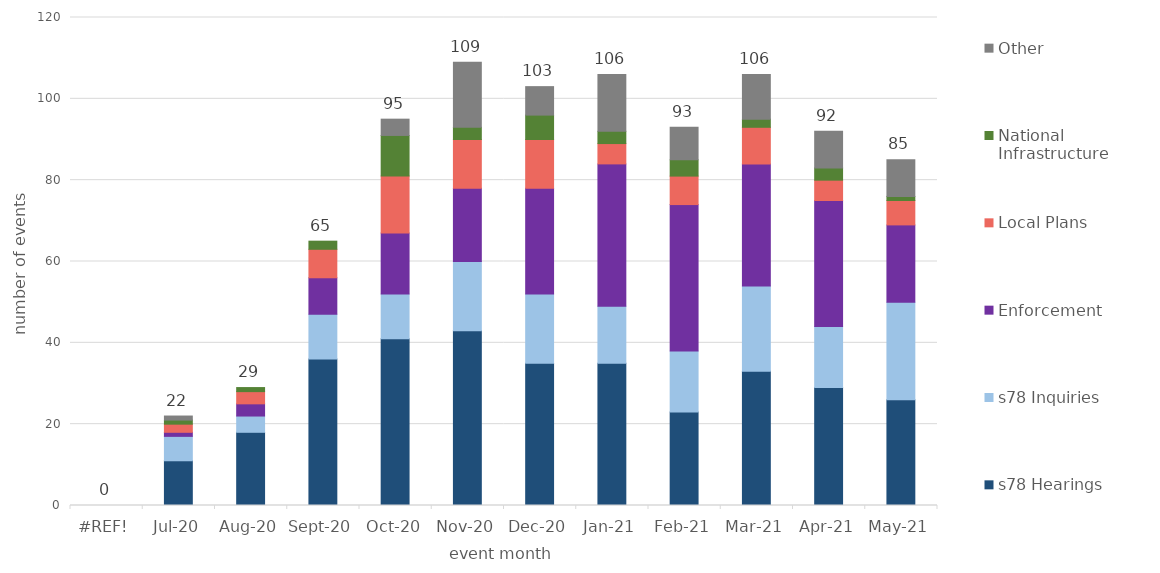
| Category | s78 Hearings | s78 Inquiries | Enforcement | Local Plans | National Infrastructure | Other |
|---|---|---|---|---|---|---|
| 0.0 | 0 | 0 | 0 | 0 | 0 | 0 |
| 2020-07-01 | 11 | 6 | 1 | 2 | 1 | 1 |
| 2020-08-01 | 18 | 4 | 3 | 3 | 1 | 0 |
| 2020-09-01 | 36 | 11 | 9 | 7 | 2 | 0 |
| 2020-10-01 | 41 | 11 | 15 | 14 | 10 | 4 |
| 2020-11-01 | 43 | 17 | 18 | 12 | 3 | 16 |
| 2020-12-01 | 35 | 17 | 26 | 12 | 6 | 7 |
| 2021-01-01 | 35 | 14 | 35 | 5 | 3 | 14 |
| 2021-02-01 | 23 | 15 | 36 | 7 | 4 | 8 |
| 2021-03-01 | 33 | 21 | 30 | 9 | 2 | 11 |
| 2021-04-01 | 29 | 15 | 31 | 5 | 3 | 9 |
| 2021-05-01 | 26 | 24 | 19 | 6 | 1 | 9 |